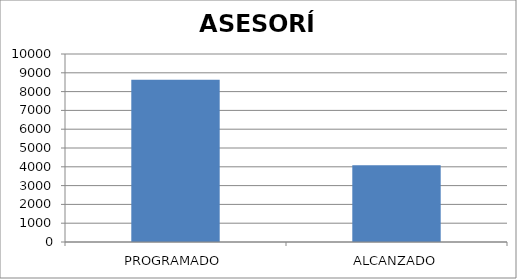
| Category | JUICIO |
|---|---|
| PROGRAMADO | 8625 |
| ALCANZADO | 4087 |